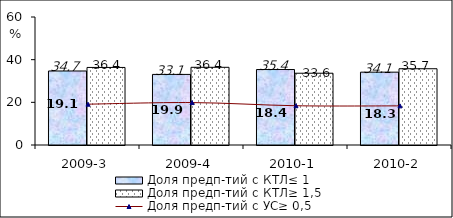
| Category | Доля предп-тий с КТЛ≤ 1 | Доля предп-тий с КТЛ≥ 1,5 |
|---|---|---|
| 2009-3 | 34.694 | 36.355 |
| 2009-4 | 33.091 | 36.421 |
| 2010-1 | 35.369 | 33.647 |
| 2010-2 | 34.143 | 35.746 |